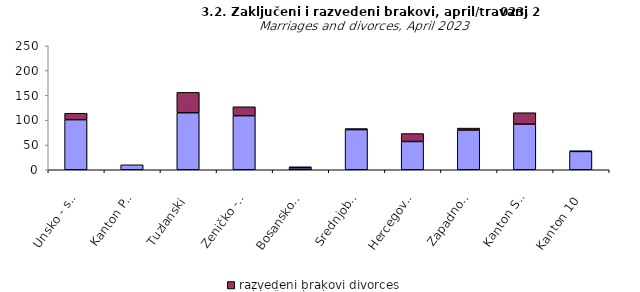
| Category | zaključeni brakovi marriages | razvedeni brakovi divorces |
|---|---|---|
| Unsko - sanski | 101 | 13 |
| Kanton Posavski | 10 | 0 |
| Tuzlanski | 115 | 41 |
| Zeničko - dobojski | 109 | 18 |
| Bosansko - podrinjski | 4 | 2 |
| Srednjobosanski | 81 | 2 |
| Hercegovačko-neretvanski | 57 | 16 |
| Zapadnohercegovački | 80 | 4 |
| Kanton Sarajevo | 92 | 23 |
| Kanton 10 | 37 | 1 |